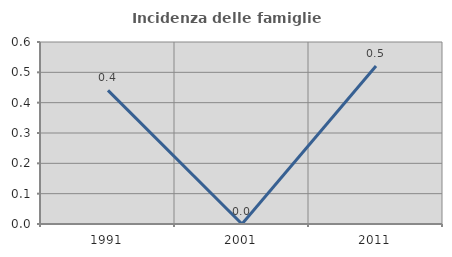
| Category | Incidenza delle famiglie numerose |
|---|---|
| 1991.0 | 0.441 |
| 2001.0 | 0 |
| 2011.0 | 0.521 |